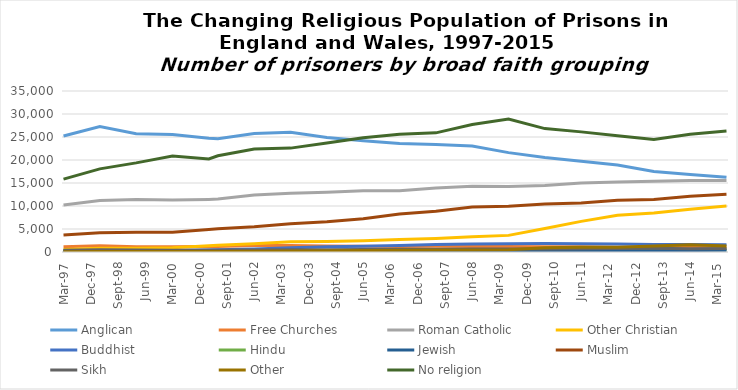
| Category | Anglican | Free Churches | Roman Catholic | Other Christian | Buddhist | Hindu | Jewish | Muslim | Sikh | Other | No religion |
|---|---|---|---|---|---|---|---|---|---|---|---|
| 1997-03-01 | 25223 | 1119 | 10238 | 549 | 226 | 198 | 288 | 3681 | 394 | 79 | 15840 |
| 1998-03-01 | 27299 | 1337 | 11172 | 801 | 324 | 304 | 214 | 4188 | 491 | 95 | 18072 |
| 1999-03-01 | 25725 | 1158 | 11386 | 833 | 306 | 243 | 192 | 4314 | 447 | 92 | 19371 |
| 2000-03-01 | 25567 | 1132 | 11327 | 919 | 285 | 246 | 160 | 4298 | 394 | 89 | 20888 |
| 2001-03-01 | 24720 | 1200 | 11435 | 1332 | 449 | 267 | 166 | 4882 | 414 | 112 | 20221 |
| 2001-06-01 | 24599 | 1193 | 11505 | 1457 | 486 | 293 | 159 | 5046 | 431 | 134 | 20907 |
| 2002-06-01 | 25752 | 1400 | 12378 | 1813 | 676 | 271 | 179 | 5502 | 442 | 168 | 22405 |
| 2003-06-01 | 26055 | 1418 | 12750 | 2239 | 947 | 339 | 184 | 6136 | 490 | 207 | 22584 |
| 2004-06-01 | 24885 | 1299 | 12984 | 2270 | 1133 | 342 | 181 | 6571 | 498 | 282 | 23709 |
| 2005-06-01 | 24168 | 1258 | 13304 | 2424 | 1237 | 370 | 197 | 7246 | 543 | 304 | 24826 |
| 2006-06-01 | 23590 | 1193 | 13340 | 2703 | 1432 | 368 | 187 | 8243 | 579 | 397 | 25598 |
| 2007-06-01 | 23353 | 1224 | 13912 | 2918 | 1609 | 357 | 231 | 8864 | 608 | 419 | 25900 |
| 2008-06-01 | 23039 | 1213 | 14296 | 3291 | 1737 | 434 | 220 | 9795 | 648 | 448 | 27710 |
| 2009-06-01 | 21605 | 1187 | 14262 | 3613 | 1800 | 438 | 218 | 9952 | 645 | 492 | 28898 |
| 2010-06-01 | 20526 | 1147 | 14437 | 5116 | 1872 | 435 | 233 | 10437 | 669 | 911 | 26830 |
| 2011-06-01 | 19713 | 1136 | 15001 | 6661 | 1793 | 452 | 228 | 10672 | 711 | 1010 | 26113 |
| 2012-06-01 | 18898 | 1047 | 15237 | 7994 | 1756 | 456 | 252 | 11248 | 777 | 1058 | 25269 |
| 2013-06-01 | 17516 | 1002 | 15367 | 8456 | 1638 | 451 | 268 | 11426 | 799 | 1308 | 24484 |
| 2014-06-01 | 16873 | 1021 | 15535 | 9277 | 1629 | 447 | 319 | 12106 | 732 | 1565 | 25619 |
| 2015-06-01 | 16230 | 861 | 15564 | 10023 | 1556 | 476 | 372 | 12543 | 788 | 1307 | 26284 |